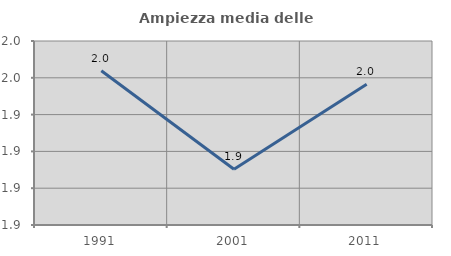
| Category | Ampiezza media delle famiglie |
|---|---|
| 1991.0 | 1.964 |
| 2001.0 | 1.91 |
| 2011.0 | 1.957 |